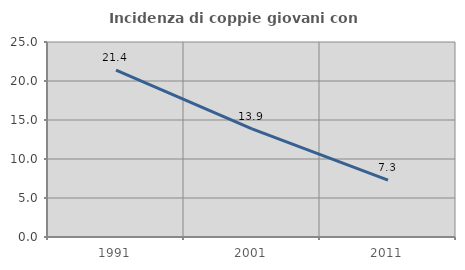
| Category | Incidenza di coppie giovani con figli |
|---|---|
| 1991.0 | 21.394 |
| 2001.0 | 13.86 |
| 2011.0 | 7.288 |